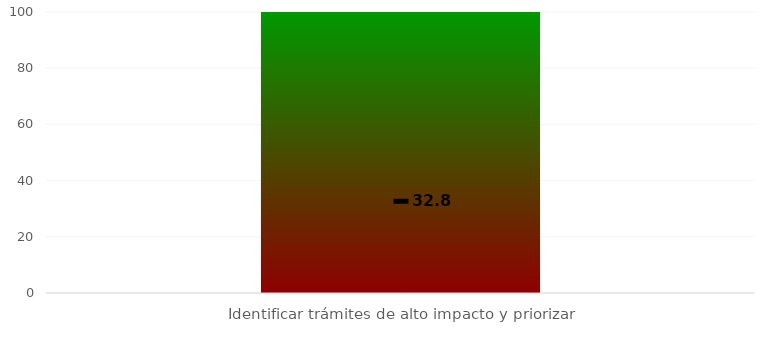
| Category | Niveles |
|---|---|
| Identificar trámites de alto impacto y priorizar | 100 |